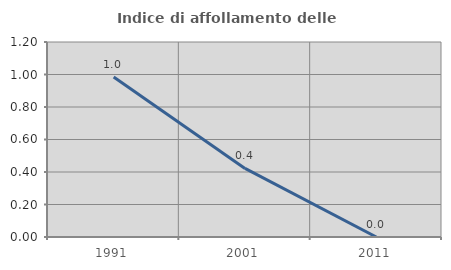
| Category | Indice di affollamento delle abitazioni  |
|---|---|
| 1991.0 | 0.985 |
| 2001.0 | 0.422 |
| 2011.0 | 0 |